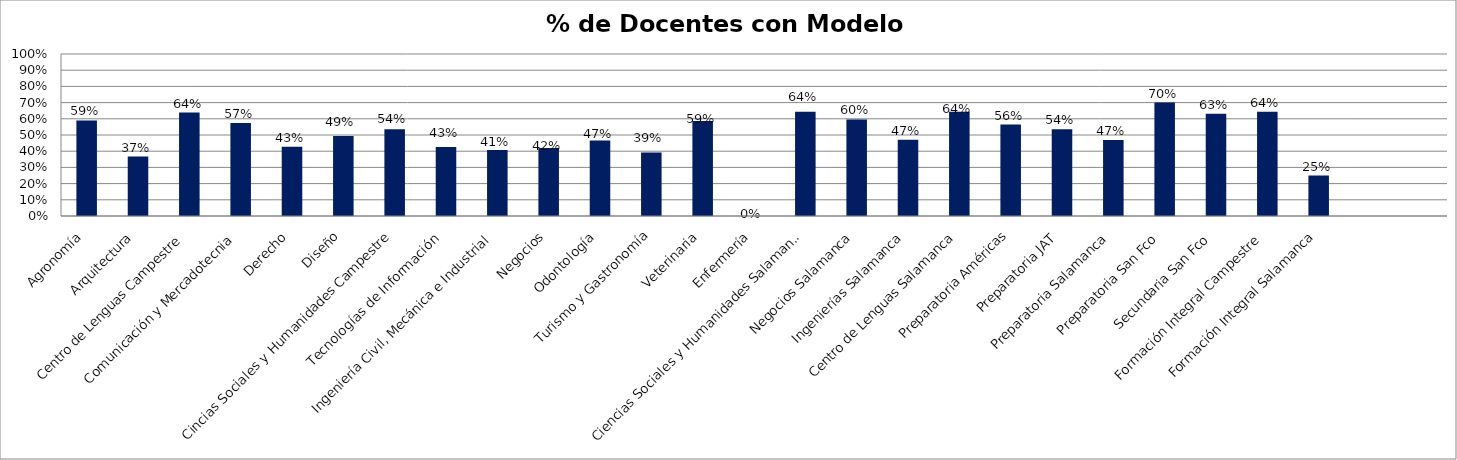
| Category | Series 1 |
|---|---|
| Agronomía | 0.59 |
| Arquitectura | 0.367 |
| Centro de Lenguas Campestre | 0.639 |
| Comunicación y Mercadotecnia | 0.574 |
| Derecho | 0.427 |
| Diseño | 0.494 |
| Cincias Sociales y Humanidades Campestre | 0.536 |
| Tecnologías de Información | 0.426 |
| Ingeniería Civil, Mecánica e Industrial | 0.407 |
| Negocios | 0.419 |
| Odontología | 0.467 |
| Turismo y Gastronomía | 0.391 |
| Veterinaria | 0.587 |
| Enfermería | 0 |
| Ciencias Sociales y Humanidades Salamanca | 0.643 |
| Negocios Salamanca | 0.596 |
| Ingenierías Salamanca | 0.471 |
| Centro de Lenguas Salamanca | 0.643 |
| Preparatoria Américas | 0.565 |
| Preparatoria JAT | 0.536 |
| Preparatoria Salamanca | 0.469 |
| Preparatoria San Fco | 0.7 |
| Secundaria San Fco | 0.632 |
| Formación Integral Campestre | 0.643 |
| Formación Integral Salamanca | 0.25 |